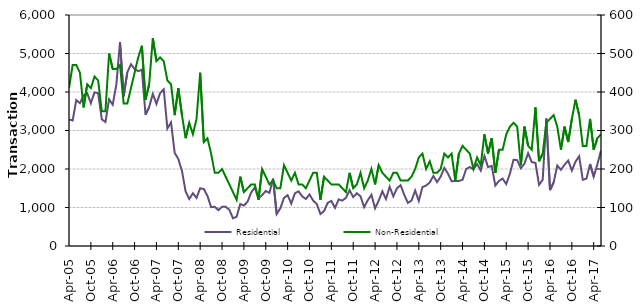
| Category | Residential |
|---|---|
| 2005-04-01 | 3290 |
| 2005-05-01 | 3260 |
| 2005-06-01 | 3790 |
| 2005-07-01 | 3710 |
| 2005-08-01 | 3910 |
| 2005-09-01 | 3970 |
| 2005-10-01 | 3710 |
| 2005-11-01 | 3990 |
| 2005-12-01 | 3970 |
| 2006-01-01 | 3290 |
| 2006-02-01 | 3220 |
| 2006-03-01 | 3810 |
| 2006-04-01 | 3670 |
| 2006-05-01 | 4200 |
| 2006-06-01 | 5300 |
| 2006-07-01 | 3890 |
| 2006-08-01 | 4510 |
| 2006-09-01 | 4720 |
| 2006-10-01 | 4600 |
| 2006-11-01 | 4540 |
| 2006-12-01 | 4580 |
| 2007-01-01 | 3410 |
| 2007-02-01 | 3610 |
| 2007-03-01 | 3950 |
| 2007-04-01 | 3690 |
| 2007-05-01 | 3970 |
| 2007-06-01 | 4070 |
| 2007-07-01 | 3050 |
| 2007-08-01 | 3210 |
| 2007-09-01 | 2420 |
| 2007-10-01 | 2260 |
| 2007-11-01 | 1950 |
| 2007-12-01 | 1420 |
| 2008-01-01 | 1220 |
| 2008-02-01 | 1370 |
| 2008-03-01 | 1250 |
| 2008-04-01 | 1500 |
| 2008-05-01 | 1480 |
| 2008-06-01 | 1300 |
| 2008-07-01 | 1010 |
| 2008-08-01 | 1020 |
| 2008-09-01 | 930 |
| 2008-10-01 | 1020 |
| 2008-11-01 | 1020 |
| 2008-12-01 | 940 |
| 2009-01-01 | 720 |
| 2009-02-01 | 760 |
| 2009-03-01 | 1090 |
| 2009-04-01 | 1050 |
| 2009-05-01 | 1150 |
| 2009-06-01 | 1390 |
| 2009-07-01 | 1520 |
| 2009-08-01 | 1240 |
| 2009-09-01 | 1320 |
| 2009-10-01 | 1430 |
| 2009-11-01 | 1380 |
| 2009-12-01 | 1750 |
| 2010-01-01 | 830 |
| 2010-02-01 | 980 |
| 2010-03-01 | 1250 |
| 2010-04-01 | 1320 |
| 2010-05-01 | 1100 |
| 2010-06-01 | 1370 |
| 2010-07-01 | 1420 |
| 2010-08-01 | 1290 |
| 2010-09-01 | 1220 |
| 2010-10-01 | 1340 |
| 2010-11-01 | 1180 |
| 2010-12-01 | 1090 |
| 2011-01-01 | 830 |
| 2011-02-01 | 910 |
| 2011-03-01 | 1120 |
| 2011-04-01 | 1170 |
| 2011-05-01 | 990 |
| 2011-06-01 | 1210 |
| 2011-07-01 | 1180 |
| 2011-08-01 | 1250 |
| 2011-09-01 | 1450 |
| 2011-10-01 | 1270 |
| 2011-11-01 | 1370 |
| 2011-12-01 | 1290 |
| 2012-01-01 | 1010 |
| 2012-02-01 | 1190 |
| 2012-03-01 | 1330 |
| 2012-04-01 | 980 |
| 2012-05-01 | 1180 |
| 2012-06-01 | 1420 |
| 2012-07-01 | 1220 |
| 2012-08-01 | 1540 |
| 2012-09-01 | 1290 |
| 2012-10-01 | 1500 |
| 2012-11-01 | 1580 |
| 2012-12-01 | 1330 |
| 2013-01-01 | 1120 |
| 2013-02-01 | 1180 |
| 2013-03-01 | 1440 |
| 2013-04-01 | 1170 |
| 2013-05-01 | 1530 |
| 2013-06-01 | 1570 |
| 2013-07-01 | 1650 |
| 2013-08-01 | 1820 |
| 2013-09-01 | 1660 |
| 2013-10-01 | 1800 |
| 2013-11-01 | 2030 |
| 2013-12-01 | 1880 |
| 2014-01-01 | 1680 |
| 2014-02-01 | 1690 |
| 2014-03-01 | 1690 |
| 2014-04-01 | 1720 |
| 2014-05-01 | 2000 |
| 2014-06-01 | 2050 |
| 2014-07-01 | 1990 |
| 2014-08-01 | 2130 |
| 2014-09-01 | 1960 |
| 2014-10-01 | 2340 |
| 2014-11-01 | 2050 |
| 2014-12-01 | 2080 |
| 2015-01-01 | 1570 |
| 2015-02-01 | 1690 |
| 2015-03-01 | 1750 |
| 2015-04-01 | 1610 |
| 2015-05-01 | 1880 |
| 2015-06-01 | 2240 |
| 2015-07-01 | 2230 |
| 2015-08-01 | 2020 |
| 2015-09-01 | 2140 |
| 2015-10-01 | 2410 |
| 2015-11-01 | 2180 |
| 2015-12-01 | 2160 |
| 2016-01-01 | 1590 |
| 2016-02-01 | 1720 |
| 2016-03-01 | 3310 |
| 2016-04-01 | 1450 |
| 2016-05-01 | 1650 |
| 2016-06-01 | 2090 |
| 2016-07-01 | 1980 |
| 2016-08-01 | 2110 |
| 2016-09-01 | 2220 |
| 2016-10-01 | 1960 |
| 2016-11-01 | 2190 |
| 2016-12-01 | 2330 |
| 2017-01-01 | 1720 |
| 2017-02-01 | 1750 |
| 2017-03-01 | 2130 |
| 2017-04-01 | 1800 |
| 2017-05-01 | 2120 |
| 2017-06-01 | 2480 |